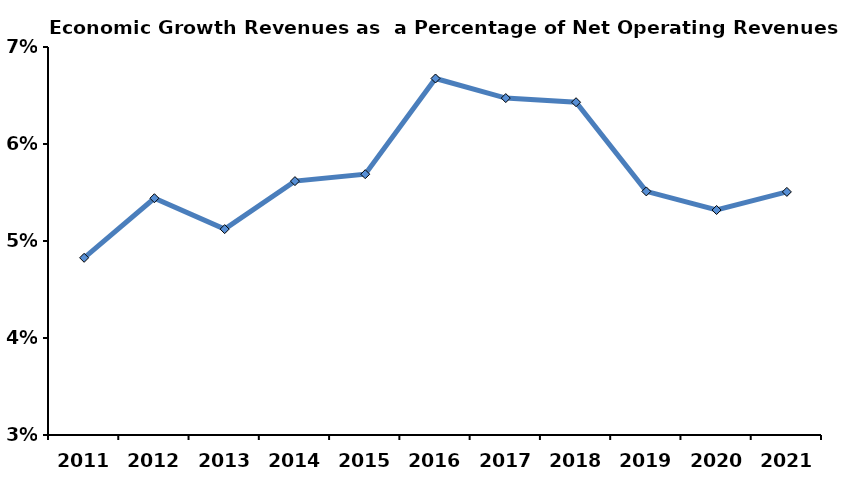
| Category | As % Net Operating Revenues |
|---|---|
| 2011.0 | 0.048 |
| 2012.0 | 0.054 |
| 2013.0 | 0.051 |
| 2014.0 | 0.056 |
| 2015.0 | 0.057 |
| 2016.0 | 0.067 |
| 2017.0 | 0.065 |
| 2018.0 | 0.064 |
| 2019.0 | 0.055 |
| 2020.0 | 0.053 |
| 2021.0 | 0.055 |